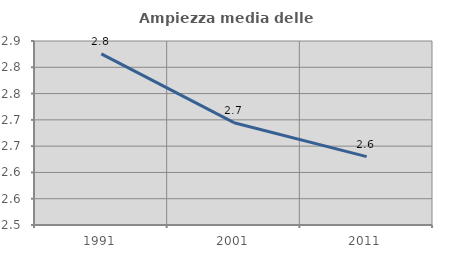
| Category | Ampiezza media delle famiglie |
|---|---|
| 1991.0 | 2.826 |
| 2001.0 | 2.695 |
| 2011.0 | 2.63 |